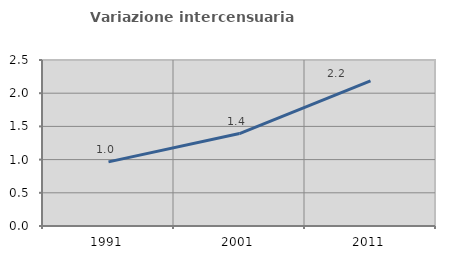
| Category | Variazione intercensuaria annua |
|---|---|
| 1991.0 | 0.966 |
| 2001.0 | 1.392 |
| 2011.0 | 2.184 |